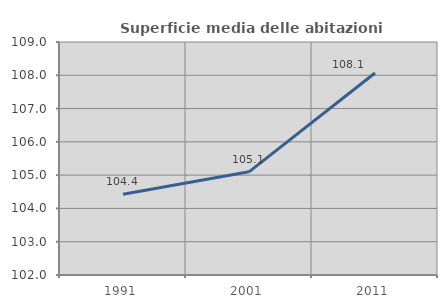
| Category | Superficie media delle abitazioni occupate |
|---|---|
| 1991.0 | 104.429 |
| 2001.0 | 105.099 |
| 2011.0 | 108.07 |